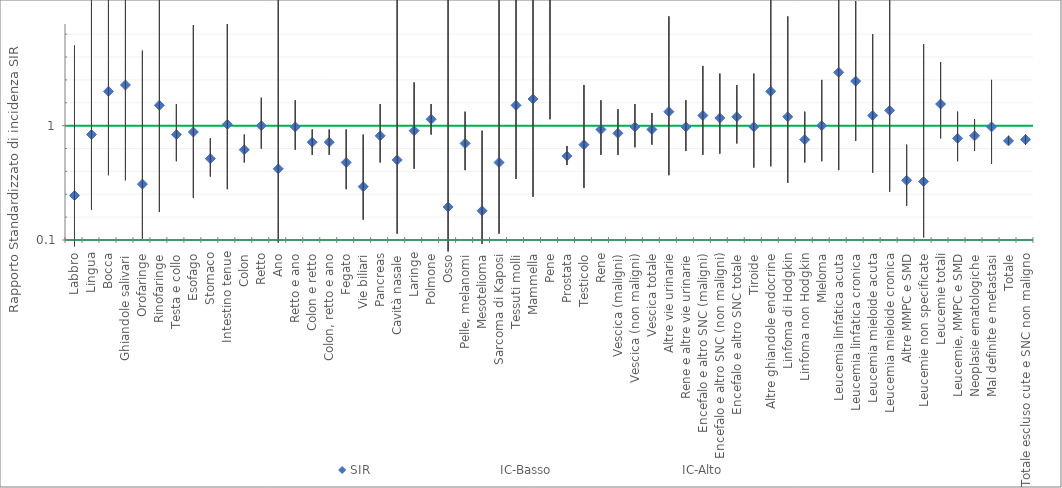
| Category | SIR | IC-Basso | IC-Alto |
|---|---|---|---|
| Labbro | 0.45 | 0.05 | 1.63 |
| Lingua | 0.93 | 0.34 | 2.02 |
| Bocca | 1.27 | 0.61 | 2.34 |
| Ghiandole salivari | 1.32 | 0.57 | 2.6 |
| Orofaringe | 0.54 | 0.11 | 1.59 |
| Rinofaringe | 1.16 | 0.32 | 2.97 |
| Testa e collo | 0.93 | 0.72 | 1.17 |
| Esofago | 0.95 | 0.43 | 1.79 |
| Stomaco | 0.74 | 0.6 | 0.9 |
| Intestino tenue | 1.01 | 0.5 | 1.8 |
| Colon | 0.81 | 0.71 | 0.93 |
| Retto | 1 | 0.82 | 1.22 |
| Ano | 0.66 | 0.08 | 2.38 |
| Retto e ano | 0.99 | 0.81 | 1.2 |
| Colon e retto | 0.87 | 0.77 | 0.97 |
| Colon, retto e ano | 0.87 | 0.77 | 0.97 |
| Fegato | 0.71 | 0.5 | 0.97 |
| Vie biliari | 0.52 | 0.26 | 0.93 |
| Pancreas | 0.92 | 0.71 | 1.17 |
| Cavità nasale | 0.73 | 0.15 | 2.12 |
| Laringe | 0.96 | 0.66 | 1.34 |
| Polmone | 1.05 | 0.93 | 1.17 |
| Osso | 0.36 | 0.01 | 2.02 |
| Pelle, melanomi | 0.86 | 0.65 | 1.11 |
| Mesotelioma | 0.33 | 0.07 | 0.96 |
| Sarcoma di Kaposi | 0.71 | 0.15 | 2.08 |
| Tessuti molli | 1.16 | 0.58 | 2.07 |
| Mammella | 1.21 | 0.44 | 2.63 |
| Pene | 2.04 | 1.05 | 3.56 |
| Prostata | 0.76 | 0.69 | 0.84 |
| Testicolo | 0.85 | 0.51 | 1.32 |
| Rene | 0.97 | 0.77 | 1.2 |
| Vescica (maligni) | 0.94 | 0.77 | 1.13 |
| Vescica (non maligni) | 0.99 | 0.83 | 1.17 |
| Vescica totale | 0.97 | 0.85 | 1.1 |
| Altre vie urinarie | 1.11 | 0.61 | 1.86 |
| Rene e altre vie urinarie | 0.99 | 0.8 | 1.2 |
| Encefalo e altro SNC (maligni) | 1.08 | 0.77 | 1.47 |
| Encefalo e altro SNC (non maligni) | 1.06 | 0.78 | 1.41 |
| Encefalo e altro SNC totale | 1.07 | 0.86 | 1.32 |
| Tiroide | 0.99 | 0.67 | 1.41 |
| Altre ghiandole endocrine | 1.27 | 0.68 | 2.18 |
| Linfoma di Hodgkin | 1.07 | 0.55 | 1.86 |
| Linfoma non Hodgkin | 0.89 | 0.71 | 1.11 |
| Mieloma | 1 | 0.72 | 1.36 |
| Leucemia linfatica acuta | 1.42 | 0.65 | 2.7 |
| Leucemia linfatica cronica | 1.35 | 0.88 | 1.98 |
| Leucemia mieloide acuta | 1.08 | 0.63 | 1.72 |
| Leucemia mieloide cronica | 1.12 | 0.48 | 2.21 |
| Altre MMPC e SMD | 0.57 | 0.37 | 0.85 |
| Leucemie non specificate | 0.56 | 0.12 | 1.64 |
| Leucemie totali | 1.17 | 0.9 | 1.5 |
| Leucemie, MMPC e SMD | 0.9 | 0.72 | 1.11 |
| Neoplasie ematologiche | 0.92 | 0.8 | 1.05 |
| Mal definite e metastasi | 0.99 | 0.7 | 1.36 |
| Totale | 0.88 | 0.85 | 0.92 |
| Totale escluso cute e SNC non maligno | 0.89 | 0.85 | 0.93 |